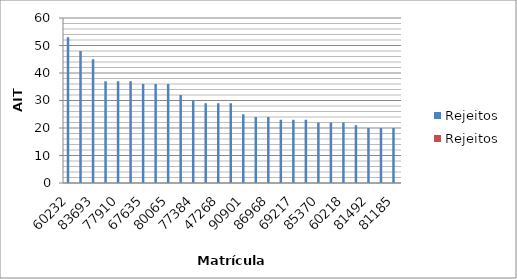
| Category | Rejeitos |
|---|---|
| 60232.0 |  |
| 67633.0 |  |
| 83693.0 |  |
| 84036.0 |  |
| 77910.0 |  |
| 753475.0 |  |
| 67635.0 |  |
| 78286.0 |  |
| 80065.0 |  |
| 98193.0 |  |
| 77384.0 |  |
| 11762.0 |  |
| 47268.0 |  |
| 77230.0 |  |
| 90901.0 |  |
| 78328.0 |  |
| 86968.0 |  |
| 69440.0 |  |
| 69217.0 |  |
| 93245.0 |  |
| 85370.0 |  |
| 78721.0 |  |
| 60218.0 |  |
| 86354.0 |  |
| 81492.0 |  |
| 80061.0 |  |
| 81185.0 |  |
| 86350.0 |  |